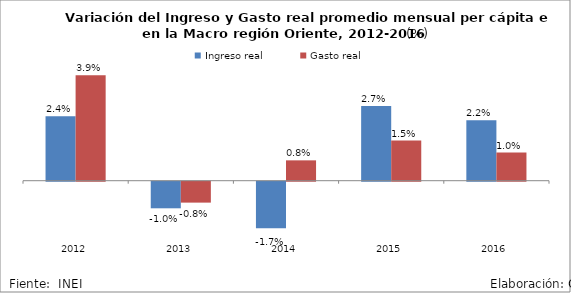
| Category | Ingreso real | Gasto real |
|---|---|---|
| 2012.0 | 0.024 | 0.039 |
| 2013.0 | -0.01 | -0.008 |
| 2014.0 | -0.017 | 0.008 |
| 2015.0 | 0.027 | 0.015 |
| 2016.0 | 0.022 | 0.01 |